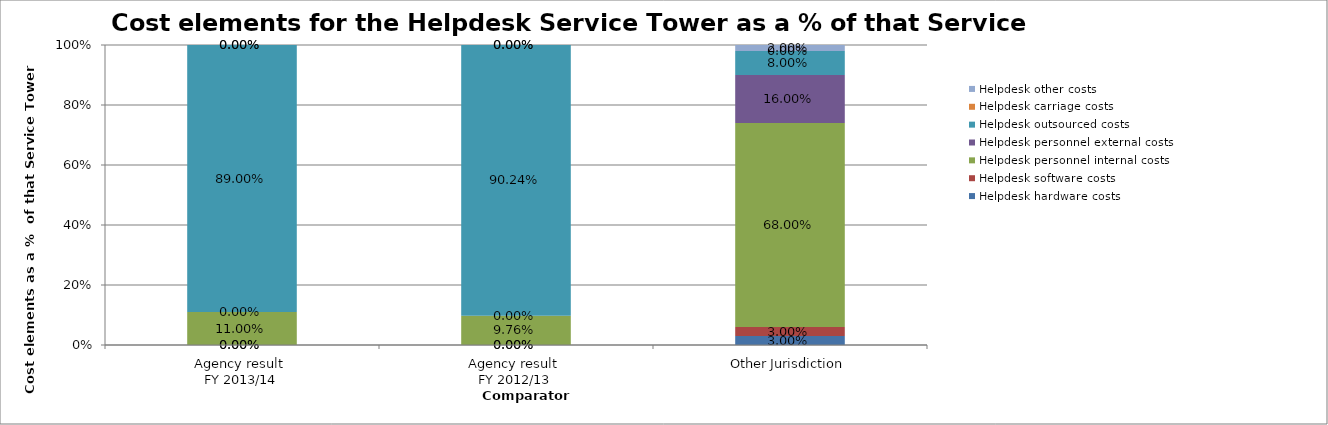
| Category | Helpdesk hardware costs | Helpdesk software costs | Helpdesk personnel internal costs | Helpdesk personnel external costs | Helpdesk outsourced costs | Helpdesk carriage costs | Helpdesk other costs |
|---|---|---|---|---|---|---|---|
| Agency result 
FY 2013/14 | 0 | 0 | 0.11 | 0 | 0.89 | 0 | 0 |
| Agency result 
FY 2012/13 | 0 | 0 | 0.098 | 0 | 0.902 | 0 | 0 |
| Other Jurisdiction | 0.03 | 0.03 | 0.68 | 0.16 | 0.08 | 0 | 0.02 |